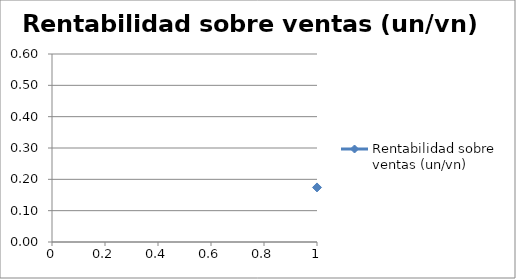
| Category | Rentabilidad sobre ventas (un/vn) |
|---|---|
| 0 | 0.174 |
| 1 | 0.434 |
| 2 | 0.394 |
| 3 | 0.427 |
| 4 | 0.348 |
| 5 | 0.48 |
| 6 | 0.43 |
| 7 | 0.458 |